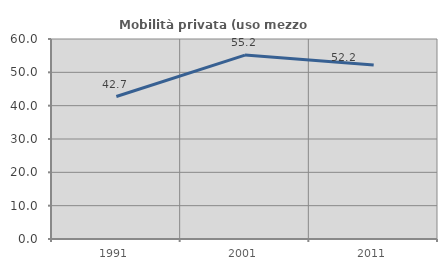
| Category | Mobilità privata (uso mezzo privato) |
|---|---|
| 1991.0 | 42.748 |
| 2001.0 | 55.172 |
| 2011.0 | 52.206 |